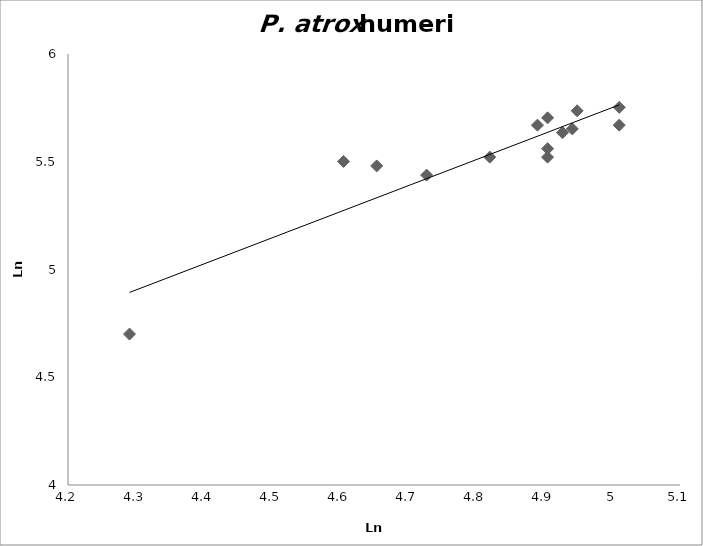
| Category | Series 0 |
|---|---|
| 4.890349128221754 | 5.67 |
| 4.820281565605037 | 5.521 |
| 4.941642422609303 | 5.652 |
| 4.727387818712341 | 5.438 |
| 4.927253685157205 | 5.635 |
| 4.90527477843843 | 5.561 |
| 5.010635294096256 | 5.753 |
| 4.290459441148391 | 4.7 |
| 4.653960350157523 | 5.481 |
| 4.948759890378168 | 5.737 |
| 5.010635294096256 | 5.67 |
| 4.90527477843843 | 5.704 |
| 4.90527477843843 | 5.521 |
| 4.605170185988092 | 5.501 |